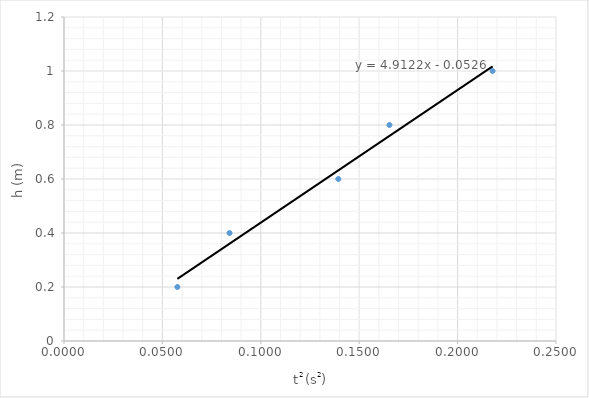
| Category | h(m) |
|---|---|
| 0.0576 | 0.2 |
| 0.08410000000000002 | 0.4 |
| 0.1393777777777778 | 0.6 |
| 0.1653777777777778 | 0.8 |
| 0.21777777777777774 | 1 |